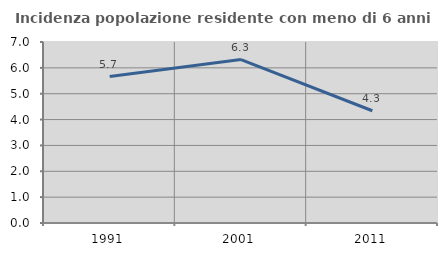
| Category | Incidenza popolazione residente con meno di 6 anni |
|---|---|
| 1991.0 | 5.663 |
| 2001.0 | 6.319 |
| 2011.0 | 4.342 |